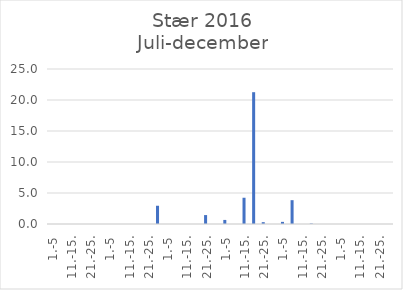
| Category | Series 0 |
|---|---|
| 1.-5 | 0 |
| 6.-10. | 0 |
| 11.-15. | 0 |
| 16.-20. | 0 |
| 21.-25. | 0 |
| 26.-31. | 0 |
| 1.-5 | 0 |
| 6.-10. | 0 |
| 11.-15. | 0 |
| 16.-20. | 0 |
| 21.-25. | 0 |
| 26.-31. | 2.945 |
| 1.-5 | 0 |
| 6.-10. | 0 |
| 11.-15. | 0 |
| 16.-20. | 0 |
| 21.-25. | 1.439 |
| 26.-30. | 0 |
| 1.-5 | 0.656 |
| 6.-10. | 0 |
| 11.-15. | 4.235 |
| 16.-20. | 21.259 |
| 21.-25. | 0.295 |
| 26.-31. | 0 |
| 1.-5 | 0.343 |
| 6.-10. | 3.842 |
| 11.-15. | 0 |
| 16.-20. | 0.075 |
| 21.-25. | 0 |
| 26.-30. | 0 |
| 1.-5 | 0 |
| 6.-10. | 0 |
| 11.-15. | 0 |
| 16.-20. | 0 |
| 21.-25. | 0 |
| 26.-31. | 0 |